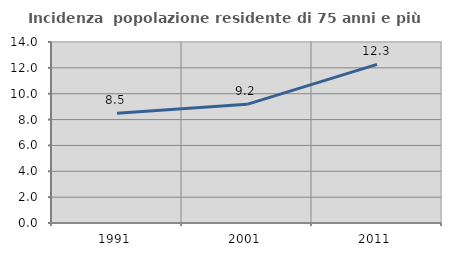
| Category | Incidenza  popolazione residente di 75 anni e più |
|---|---|
| 1991.0 | 8.481 |
| 2001.0 | 9.18 |
| 2011.0 | 12.267 |